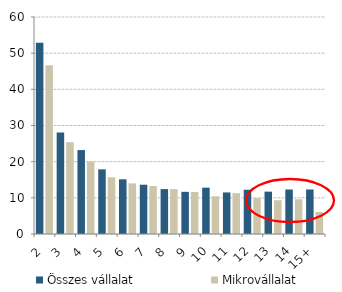
| Category | Összes vállalat | Mikrovállalat |
|---|---|---|
| 2 | 52.9 | 46.655 |
| 3 | 28.083 | 25.383 |
| 4 | 23.203 | 20.019 |
| 5 | 17.878 | 15.682 |
| 6 | 15.126 | 14.003 |
| 7 | 13.629 | 13.246 |
| 8 | 12.415 | 12.416 |
| 9 | 11.659 | 11.632 |
| 10 | 12.815 | 10.435 |
| 11 | 11.492 | 11.286 |
| 12 | 12.231 | 9.925 |
| 13 | 11.71 | 9.334 |
| 14 | 12.299 | 9.605 |
| 15+ | 12.309 | 6.077 |